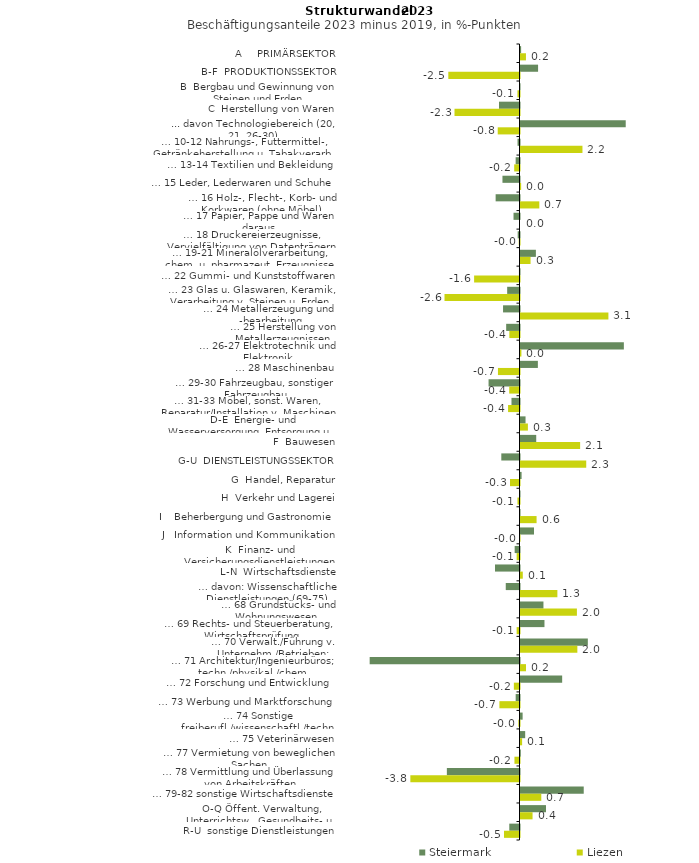
| Category | Steiermark | Liezen |
|---|---|---|
| A     PRIMÄRSEKTOR | 0.022 | 0.19 |
| B-F  PRODUKTIONSSEKTOR | 0.612 | -2.476 |
| B  Bergbau und Gewinnung von Steinen und Erden | -0.009 | -0.071 |
| C  Herstellung von Waren | -0.714 | -2.261 |
| ... davon Technologiebereich (20, 21, 26-30) | 3.66 | -0.757 |
| … 10-12 Nahrungs-, Futtermittel-, Getränkeherstellung u. Tabakverarb. | -0.068 | 2.155 |
| … 13-14 Textilien und Bekleidung | -0.134 | -0.184 |
| … 15 Leder, Lederwaren und Schuhe | -0.593 | 0.022 |
| … 16 Holz-, Flecht-, Korb- und Korkwaren (ohne Möbel)  | -0.83 | 0.654 |
| … 17 Papier, Pappe und Waren daraus  | -0.208 | 0 |
| … 18 Druckereierzeugnisse, Vervielfältigung von Datenträgern | -0.063 | -0.026 |
| … 19-21 Mineralölverarbeitung, chem. u. pharmazeut. Erzeugnisse | 0.535 | 0.35 |
| … 22 Gummi- und Kunststoffwaren | -0.02 | -1.579 |
| … 23 Glas u. Glaswaren, Keramik, Verarbeitung v. Steinen u. Erden  | -0.429 | -2.608 |
| … 24 Metallerzeugung und -bearbeitung | -0.572 | 3.058 |
| … 25 Herstellung von Metallerzeugnissen  | -0.464 | -0.353 |
| … 26-27 Elektrotechnik und Elektronik | 3.595 | 0.031 |
| … 28 Maschinenbau | 0.604 | -0.75 |
| … 29-30 Fahrzeugbau, sonstiger Fahrzeugbau | -1.076 | -0.358 |
| … 31-33 Möbel, sonst. Waren, Reparatur/Installation v. Maschinen | -0.279 | -0.398 |
| D-E  Energie- und Wasserversorgung, Entsorgung u. Rückgewinnung | 0.175 | 0.258 |
| F  Bauwesen | 0.547 | 2.074 |
| G-U  DIENSTLEISTUNGSSEKTOR | -0.633 | 2.286 |
| G  Handel, Reparatur | 0.038 | -0.331 |
| H  Verkehr und Lagerei | -0.011 | -0.07 |
| I    Beherbergung und Gastronomie | -0.007 | 0.559 |
| J   Information und Kommunikation | 0.471 | -0.014 |
| K  Finanz- und Versicherungsdienstleistungen | -0.168 | -0.099 |
| L-N  Wirtschaftsdienste | -0.853 | 0.08 |
| … davon: Wissenschaftliche Dienstleistungen (69-75) | -0.478 | 1.283 |
| … 68 Grundstücks- und Wohnungswesen  | 0.798 | 1.962 |
| … 69 Rechts- und Steuerberatung, Wirtschaftsprüfung | 0.834 | -0.099 |
| … 70 Verwalt./Führung v. Unternehm./Betrieben; Unternehmensberat. | 2.342 | 1.978 |
| … 71 Architektur/Ingenieurbüros; techn./physikal./chem. Untersuchung | -5.212 | 0.191 |
| … 72 Forschung und Entwicklung  | 1.449 | -0.196 |
| … 73 Werbung und Marktforschung | -0.133 | -0.699 |
| … 74 Sonstige freiberufl./wissenschaftl./techn. Tätigkeiten | 0.074 | -0.04 |
| … 75 Veterinärwesen | 0.163 | 0.056 |
| … 77 Vermietung von beweglichen Sachen  | 0.011 | -0.176 |
| … 78 Vermittlung und Überlassung von Arbeitskräften | -2.527 | -3.796 |
| … 79-82 sonstige Wirtschaftsdienste | 2.199 | 0.723 |
| O-Q Öffent. Verwaltung, Unterrichtsw., Gesundheits- u. Sozialwesen | 0.886 | 0.419 |
| R-U  sonstige Dienstleistungen | -0.355 | -0.538 |